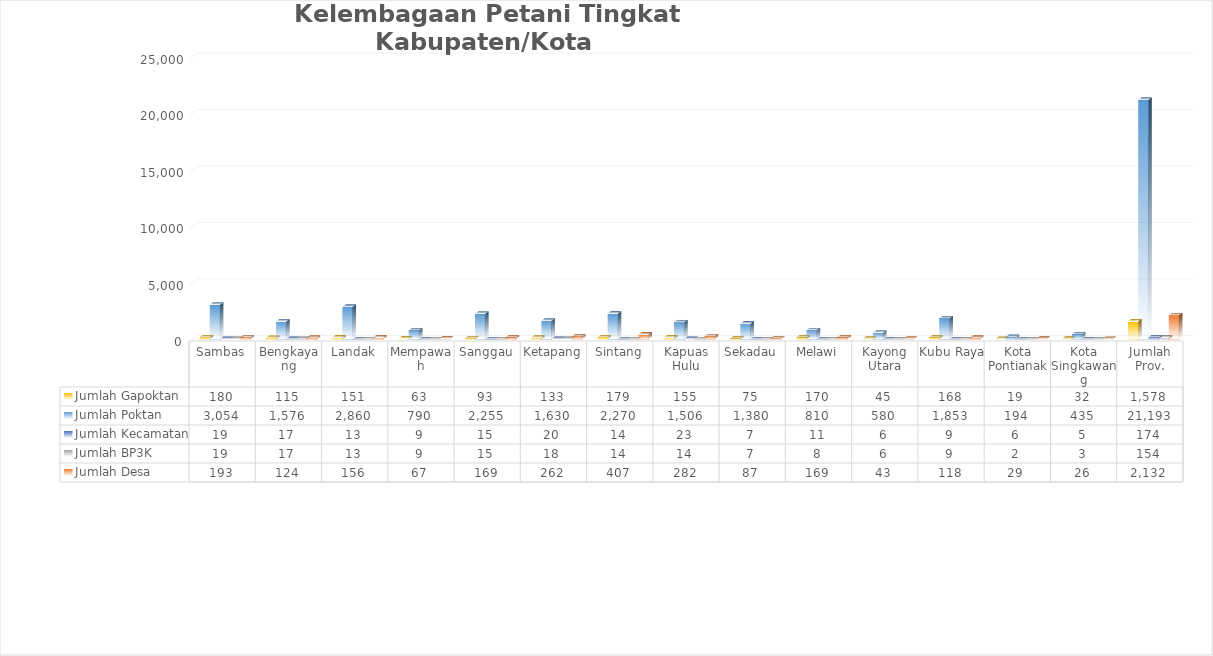
| Category | Jumlah Gapoktan | Jumlah Poktan | Jumlah Kecamatan | Jumlah BP3K | Jumlah Desa |
|---|---|---|---|---|---|
| Sambas | 180 | 3054 | 19 | 19 | 193 |
| Bengkayang | 115 | 1576 | 17 | 17 | 124 |
| Landak | 151 | 2860 | 13 | 13 | 156 |
| Mempawah | 63 | 790 | 9 | 9 | 67 |
| Sanggau | 93 | 2255 | 15 | 15 | 169 |
| Ketapang | 133 | 1630 | 20 | 18 | 262 |
| Sintang | 179 | 2270 | 14 | 14 | 407 |
| Kapuas Hulu | 155 | 1506 | 23 | 14 | 282 |
| Sekadau | 75 | 1380 | 7 | 7 | 87 |
| Melawi | 170 | 810 | 11 | 8 | 169 |
| Kayong Utara | 45 | 580 | 6 | 6 | 43 |
| Kubu Raya | 168 | 1853 | 9 | 9 | 118 |
| Kota Pontianak | 19 | 194 | 6 | 2 | 29 |
| Kota Singkawang | 32 | 435 | 5 | 3 | 26 |
| Jumlah Prov. | 1578 | 21193 | 174 | 154 | 2132 |